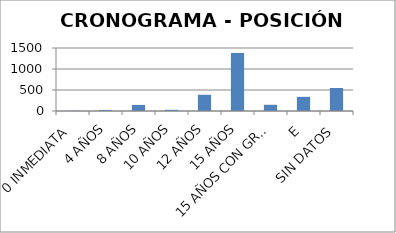
| Category | CANTIDAD DE POSICIONES |
|---|---|
| 0 INMEDIATA | 5 |
| 4 AÑOS | 25 |
| 8 AÑOS | 145 |
| 10 AÑOS | 28 |
| 12 AÑOS | 386 |
| 15 AÑOS | 1382 |
| 15 AÑOS CON GRACIA | 148 |
| E | 337 |
| SIN DATOS | 547 |